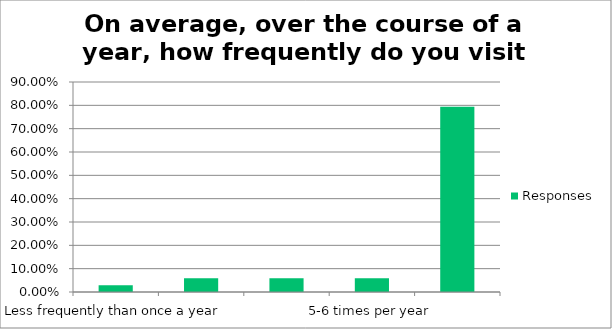
| Category | Responses |
|---|---|
| Less frequently than once a year | 0.029 |
| 1-2 times per year | 0.059 |
| 3-4 times per year | 0.059 |
| 5-6 times per year | 0.059 |
| More frequently than six times a year | 0.794 |